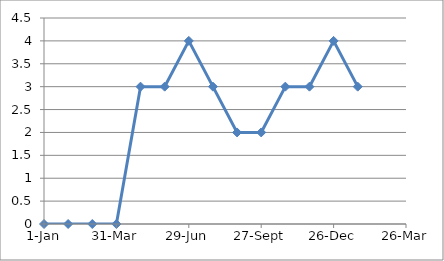
| Category | Series 0 |
|---|---|
| 42370.0 | 0 |
| 42400.0 | 0 |
| 42430.0 | 0 |
| 42460.0 | 0 |
| 42490.0 | 3 |
| 42520.0 | 3 |
| 42550.0 | 4 |
| 42580.0 | 3 |
| 42610.0 | 2 |
| 42640.0 | 2 |
| 42670.0 | 3 |
| 42700.0 | 3 |
| 42730.0 | 4 |
| 42760.0 | 3 |